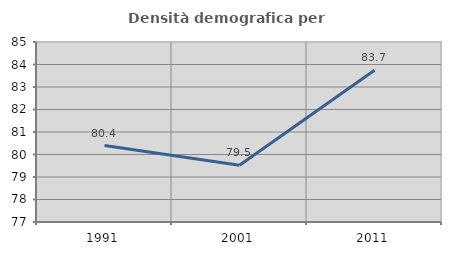
| Category | Densità demografica |
|---|---|
| 1991.0 | 80.396 |
| 2001.0 | 79.523 |
| 2011.0 | 83.743 |